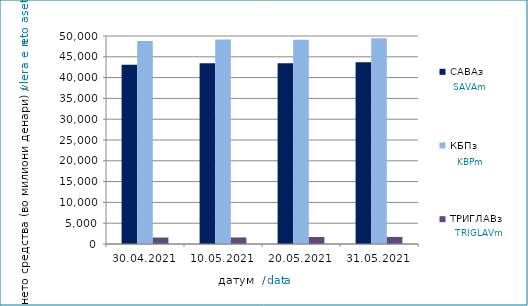
| Category | САВАз | КБПз | ТРИГЛАВз |
|---|---|---|---|
| 2021-04-30 | 43094.773 | 48800.26 | 1556.488 |
| 2021-05-10 | 43427.249 | 49172.051 | 1575.053 |
| 2021-05-20 | 43442.555 | 49108.632 | 1686.41 |
| 2021-05-31 | 43708.556 | 49483.222 | 1698.924 |